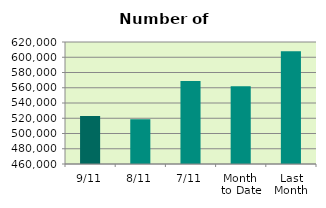
| Category | Series 0 |
|---|---|
| 9/11 | 522856 |
| 8/11 | 518566 |
| 7/11 | 568946 |
| Month 
to Date | 561838.571 |
| Last
Month | 607838.609 |